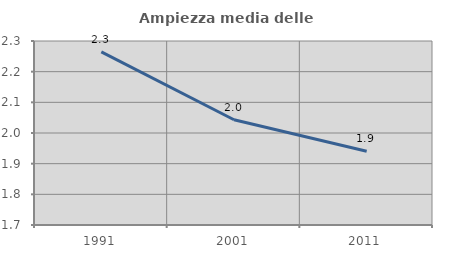
| Category | Ampiezza media delle famiglie |
|---|---|
| 1991.0 | 2.265 |
| 2001.0 | 2.043 |
| 2011.0 | 1.94 |